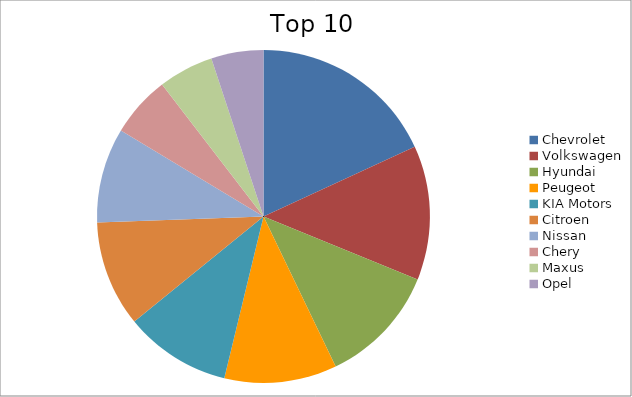
| Category | Series 0 |
|---|---|
| Chevrolet | 18.13 |
| Volkswagen | 13.05 |
| Hyundai | 11.69 |
| Peugeot | 10.92 |
| KIA Motors | 10.35 |
| Citroen | 10.3 |
| Nissan | 9.2 |
| Chery | 5.94 |
| Maxus | 5.36 |
| Opel | 5.07 |